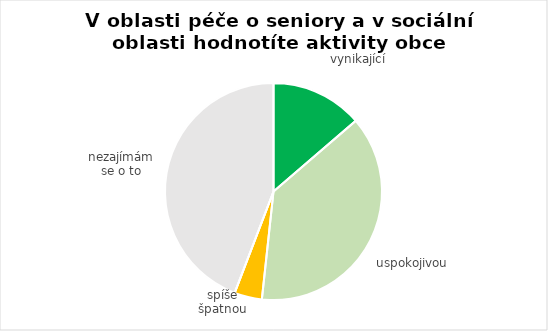
| Category | Series 0 |
|---|---|
| vynikající | 40 |
| uspokojivou | 111 |
| spíše špatnou | 12 |
| absolutně špatnou | 0 |
| nezajímám se o to | 129 |